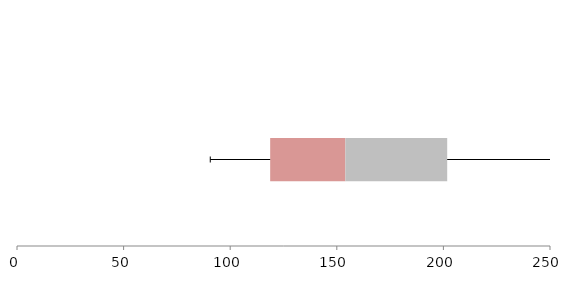
| Category | Series 1 | Series 2 | Series 3 |
|---|---|---|---|
| 0 | 118.749 | 35.268 | 47.766 |